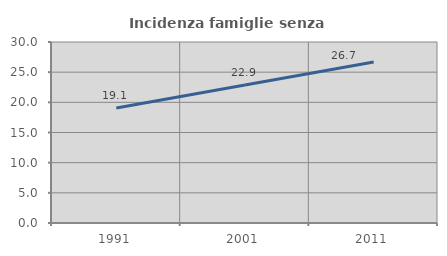
| Category | Incidenza famiglie senza nuclei |
|---|---|
| 1991.0 | 19.064 |
| 2001.0 | 22.865 |
| 2011.0 | 26.668 |